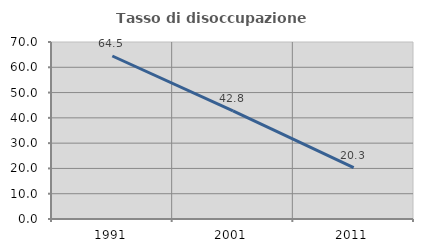
| Category | Tasso di disoccupazione giovanile  |
|---|---|
| 1991.0 | 64.461 |
| 2001.0 | 42.803 |
| 2011.0 | 20.33 |